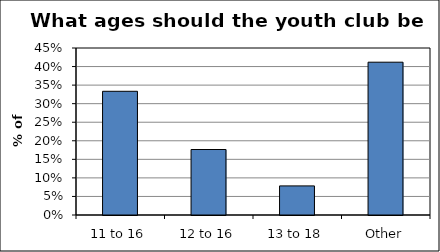
| Category | Series 0 |
|---|---|
| 11 to 16 | 0.333 |
| 12 to 16 | 0.176 |
| 13 to 18 | 0.078 |
| Other | 0.412 |